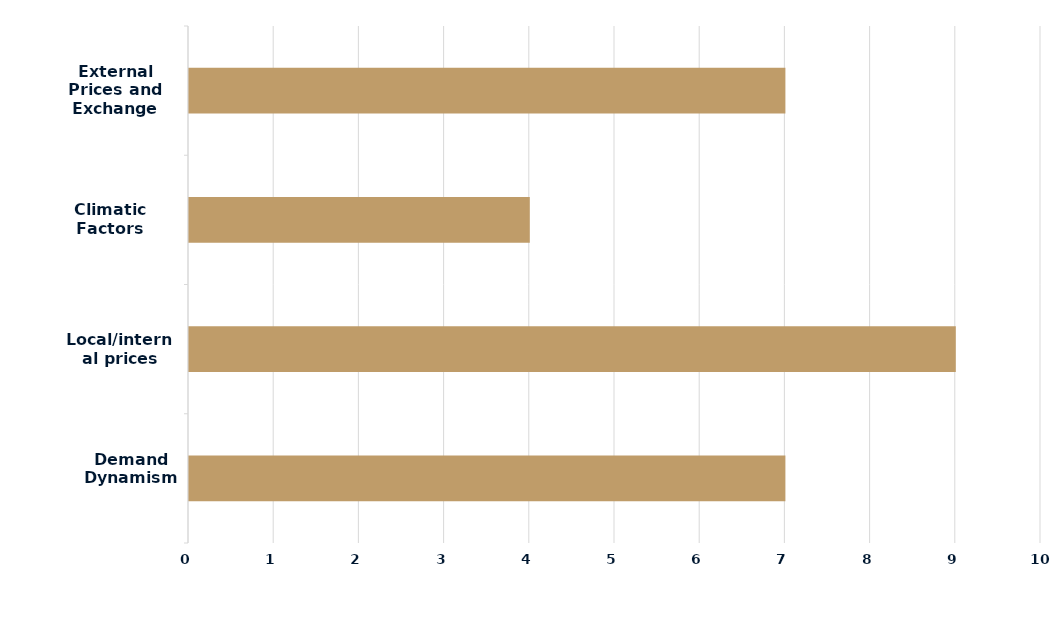
| Category | Series 0 |
|---|---|
| Demand Dynamism | 7 |
| Local/internal prices | 9 |
| Climatic Factors | 4 |
| External Prices and Exchange Rate | 7 |